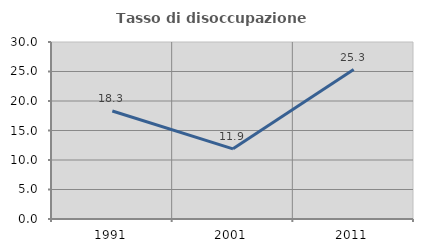
| Category | Tasso di disoccupazione giovanile  |
|---|---|
| 1991.0 | 18.305 |
| 2001.0 | 11.892 |
| 2011.0 | 25.333 |